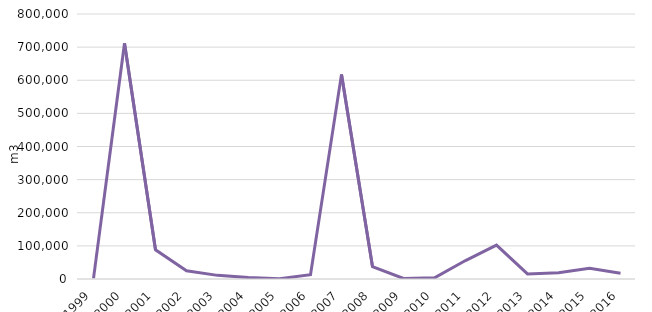
| Category | Wood mass affected by fire in m3 |
|---|---|
| 1999.0 | 1905 |
| 2000.0 | 711782 |
| 2001.0 | 88260 |
| 2002.0 | 24661.28 |
| 2003.0 | 10987 |
| 2004.0 | 4322.3 |
| 2005.0 | 1063 |
| 2006.0 | 12978 |
| 2007.0 | 617678.67 |
| 2008.0 | 37362.5 |
| 2009.0 | 1551 |
| 2010.0 | 3443 |
| 2011.0 | 55743.3 |
| 2012.0 | 102160.45 |
| 2013.0 | 15267.65 |
| 2014.0 | 19152 |
| 2015.0 | 32494 |
| 2016.0 | 17573.7 |